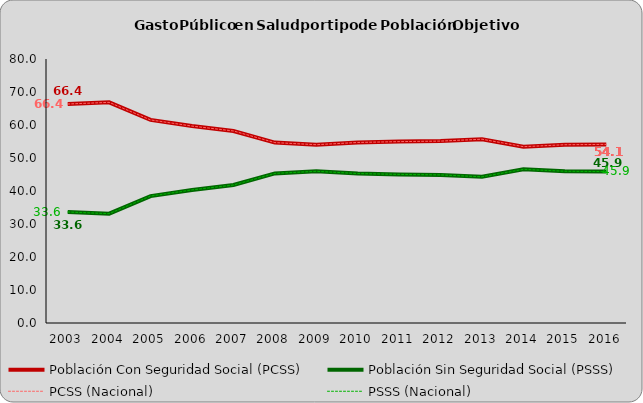
| Category | Población Con Seguridad Social (PCSS) | Población Sin Seguridad Social (PSSS) | PCSS (Nacional) | PSSS (Nacional) |
|---|---|---|---|---|
| 2003.0 | 66.358 | 33.642 | 66.358 | 33.642 |
| 2004.0 | 66.866 | 33.134 | 66.866 | 33.134 |
| 2005.0 | 61.538 | 38.462 | 61.538 | 38.462 |
| 2006.0 | 59.673 | 40.327 | 59.673 | 40.327 |
| 2007.0 | 58.19 | 41.81 | 58.19 | 41.81 |
| 2008.0 | 54.665 | 45.335 | 54.665 | 45.335 |
| 2009.0 | 54.027 | 45.973 | 54.027 | 45.973 |
| 2010.0 | 54.706 | 45.294 | 54.706 | 45.294 |
| 2011.0 | 54.967 | 45.033 | 54.967 | 45.033 |
| 2012.0 | 55.121 | 44.879 | 55.121 | 44.879 |
| 2013.0 | 55.693 | 44.307 | 55.693 | 44.307 |
| 2014.0 | 53.427 | 46.573 | 53.427 | 46.573 |
| 2015.0 | 54.019 | 45.981 | 54.019 | 45.981 |
| 2016.0 | 54.125 | 45.875 | 54.125 | 45.875 |